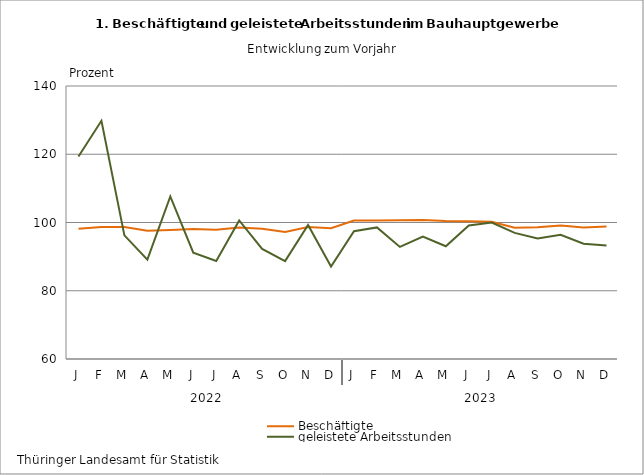
| Category | Beschäftigte | geleistete Arbeitsstunden |
|---|---|---|
| J | 98.136 | 119.359 |
| F | 98.653 | 129.807 |
| M | 98.666 | 96.224 |
| A | 97.608 | 89.122 |
| M | 97.796 | 107.626 |
| J | 98.066 | 91.145 |
| J | 97.865 | 88.706 |
| A | 98.556 | 100.602 |
| S | 98.14 | 92.251 |
| O | 97.193 | 88.697 |
| N | 98.707 | 99.281 |
| D | 98.344 | 87.107 |
| J | 100.583 | 97.468 |
| F | 100.583 | 98.561 |
| M | 100.69 | 92.847 |
| A | 100.765 | 95.884 |
| M | 100.456 | 93.037 |
| J | 100.393 | 99.153 |
| J | 100.204 | 99.999 |
| A | 98.452 | 96.966 |
| S | 98.619 | 95.307 |
| O | 99.103 | 96.394 |
| N | 98.556 | 93.759 |
| D | 98.821 | 93.264 |